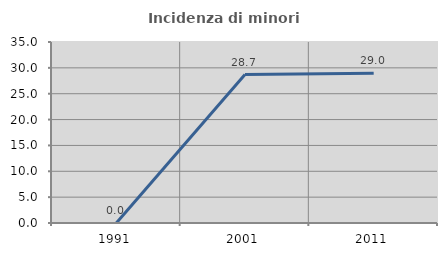
| Category | Incidenza di minori stranieri |
|---|---|
| 1991.0 | 0 |
| 2001.0 | 28.704 |
| 2011.0 | 28.956 |